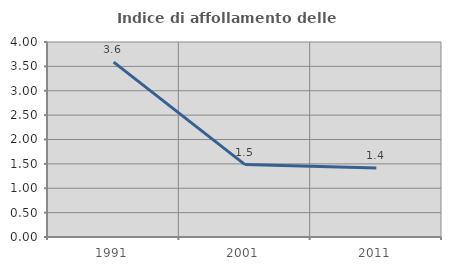
| Category | Indice di affollamento delle abitazioni  |
|---|---|
| 1991.0 | 3.587 |
| 2001.0 | 1.485 |
| 2011.0 | 1.416 |